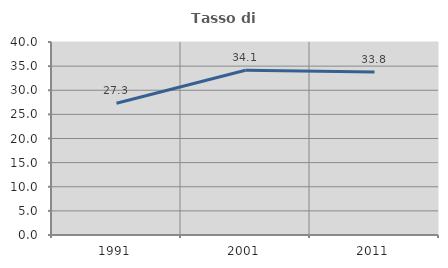
| Category | Tasso di occupazione   |
|---|---|
| 1991.0 | 27.304 |
| 2001.0 | 34.144 |
| 2011.0 | 33.782 |